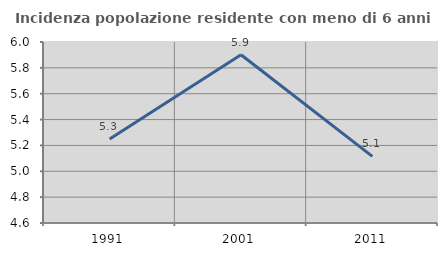
| Category | Incidenza popolazione residente con meno di 6 anni |
|---|---|
| 1991.0 | 5.25 |
| 2001.0 | 5.901 |
| 2011.0 | 5.116 |